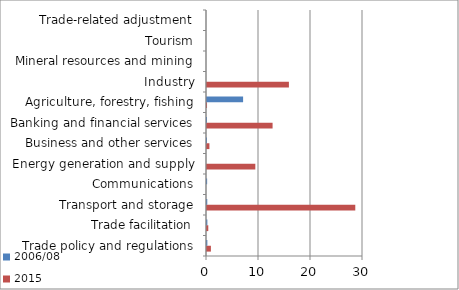
| Category | 2015 | 2006/08 |
|---|---|---|
| Trade policy and regulations | 0.75 | 0.068 |
| Trade facilitation | 0.247 | 0.071 |
| Transport and storage | 28.516 | 0.052 |
| Communications | 0 | 0.025 |
| Energy generation and supply | 9.294 | 0 |
| Business and other services | 0.465 | -0.686 |
| Banking and financial services | 12.612 | 0.001 |
| Agriculture, forestry, fishing | 0.005 | 6.943 |
| Industry | 15.751 | 0 |
| Mineral resources and mining | 0 | 0 |
| Tourism | 0 | 0 |
| Trade-related adjustment | 0 | 0 |